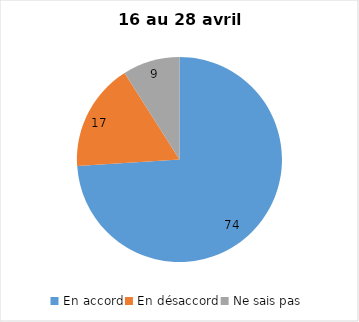
| Category | Series 0 |
|---|---|
| En accord | 74 |
| En désaccord | 17 |
| Ne sais pas | 9 |